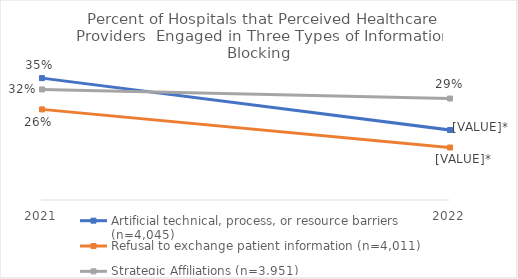
| Category | Artificial technical, process, or resource barriers (n=4,045) | Refusal to exchange patient information (n=4,011) | Strategic Affiliations (n=3,951) |
|---|---|---|---|
| 2021.0 | 0.348 | 0.259 | 0.316 |
| 2022.0 | 0.2 | 0.15 | 0.29 |